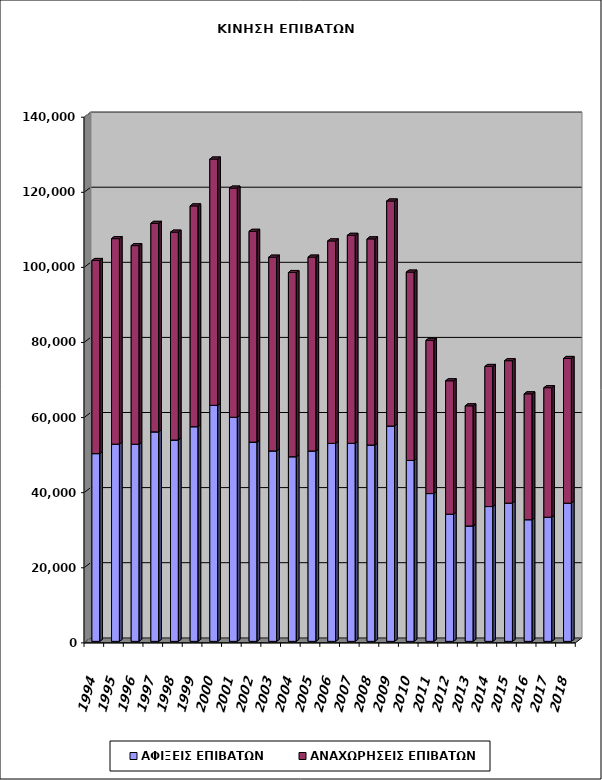
| Category | ΑΦΙΞΕΙΣ ΕΠΙΒΑΤΩΝ | ΑΝΑΧΩΡΗΣΕΙΣ ΕΠΙΒΑΤΩΝ |
|---|---|---|
| 1994.0 | 50004 | 51435 |
| 1995.0 | 52525 | 54732 |
| 1996.0 | 52510 | 52890 |
| 1997.0 | 55790 | 55536 |
| 1998.0 | 53622 | 55368 |
| 1999.0 | 57174 | 58805 |
| 2000.0 | 62864 | 65593 |
| 2001.0 | 59684 | 61032 |
| 2002.0 | 53062 | 56145 |
| 2003.0 | 50721 | 51600 |
| 2004.0 | 49170 | 49068 |
| 2005.0 | 50706 | 51628 |
| 2006.0 | 52724 | 53925 |
| 2007.0 | 52741 | 55398 |
| 2008.0 | 52286 | 54908 |
| 2009.0 | 57350 | 59931 |
| 2010.0 | 48184 | 50162 |
| 2011.0 | 39364 | 40802 |
| 2012.0 | 33870 | 35528 |
| 2013.0 | 30730 | 32003 |
| 2014.0 | 35904 | 37315 |
| 2015.0 | 36810 | 37936 |
| 2016.0 | 32404 | 33514 |
| 2017.0 | 33065 | 34494 |
| 2018.0 | 36808 | 38537 |